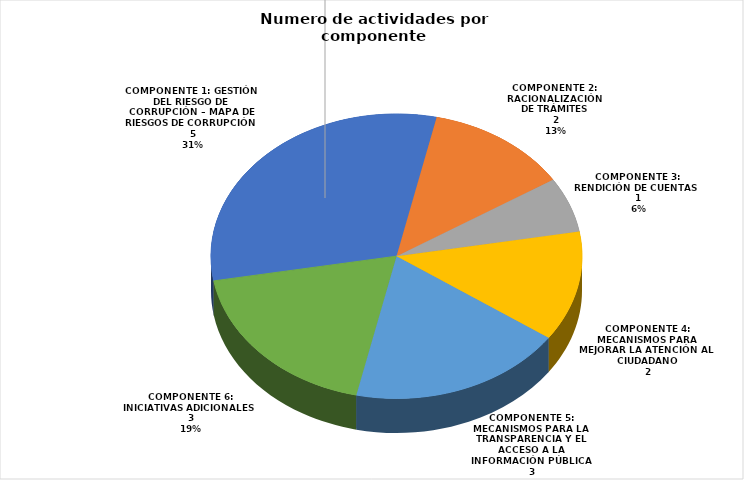
| Category | Cantidad de Actividades |
|---|---|
| COMPONENTE 1: GESTIÓN DEL RIESGO DE CORRUPCIÓN – MAPA DE RIESGOS DE CORRUPCIÓN | 5 |
| COMPONENTE 2: RACIONALIZACIÓN DE TRÁMITES | 2 |
| COMPONENTE 3: RENDICIÓN DE CUENTAS | 1 |
| COMPONENTE 4: MECANISMOS PARA MEJORAR LA ATENCIÓN AL CIUDADANO | 2 |
| COMPONENTE 5: MECANISMOS PARA LA TRANSPARENCIA Y EL ACCESO A LA INFORMACIÓN PÚBLICA | 3 |
| COMPONENTE 6: INICIATIVAS ADICIONALES | 3 |